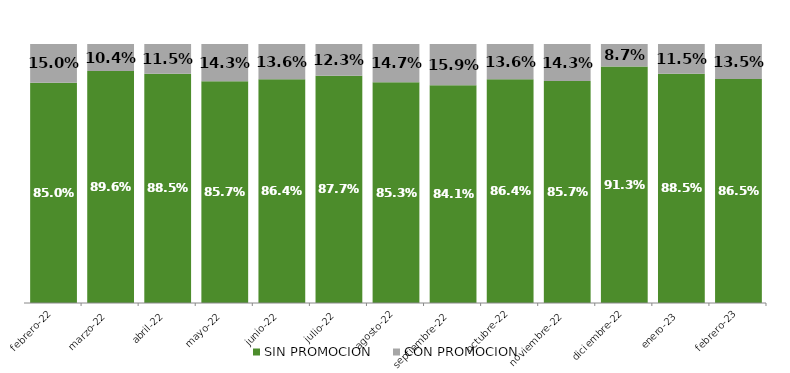
| Category | SIN PROMOCION   | CON PROMOCION   |
|---|---|---|
| 2022-02-01 | 0.85 | 0.15 |
| 2022-03-01 | 0.896 | 0.104 |
| 2022-04-01 | 0.885 | 0.115 |
| 2022-05-01 | 0.857 | 0.143 |
| 2022-06-01 | 0.864 | 0.136 |
| 2022-07-01 | 0.877 | 0.123 |
| 2022-08-01 | 0.853 | 0.147 |
| 2022-09-01 | 0.841 | 0.159 |
| 2022-10-01 | 0.864 | 0.136 |
| 2022-11-01 | 0.857 | 0.143 |
| 2022-12-01 | 0.913 | 0.087 |
| 2023-01-01 | 0.885 | 0.115 |
| 2023-02-01 | 0.865 | 0.135 |